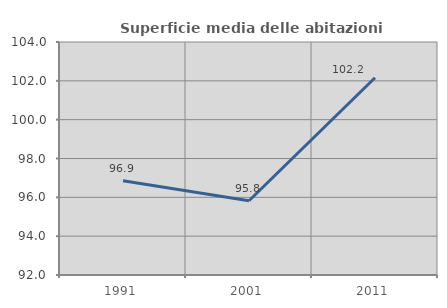
| Category | Superficie media delle abitazioni occupate |
|---|---|
| 1991.0 | 96.854 |
| 2001.0 | 95.822 |
| 2011.0 | 102.161 |